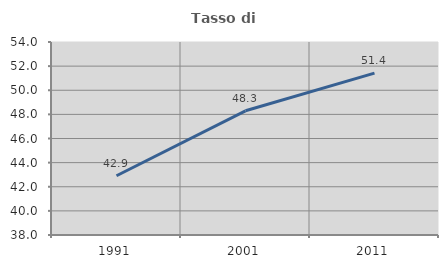
| Category | Tasso di occupazione   |
|---|---|
| 1991.0 | 42.912 |
| 2001.0 | 48.295 |
| 2011.0 | 51.42 |